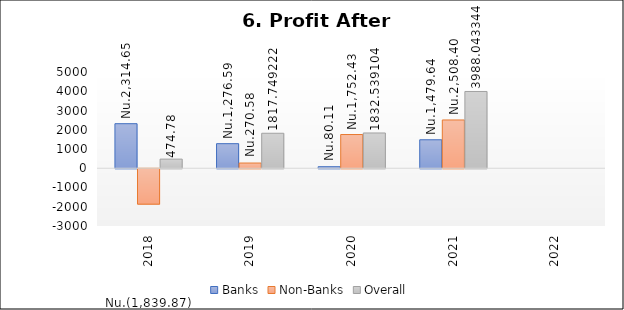
| Category | Banks | Non-Banks | Overall |
|---|---|---|---|
| 2018-12-01 | 2314.648 | -1839.873 | 474.78 |
| 2019-12-01 | 1276.592 | 270.579 | 1817.749 |
| 2020-12-01 | 80.106 | 1752.433 | 1832.539 |
| 2021-12-01 | 1479.639 | 2508.404 | 3988.043 |
| 2022-12-01 | 1976.641 | 2114.935 | 4091.576 |